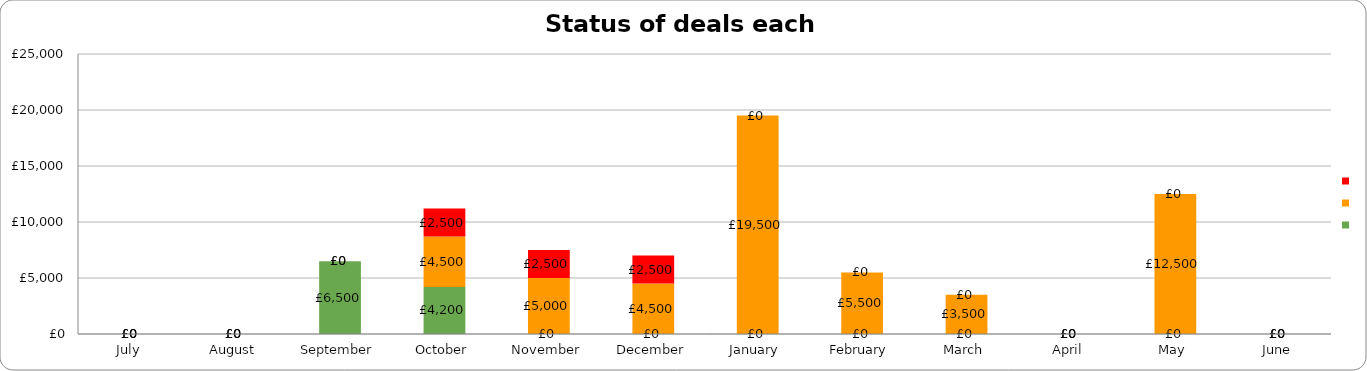
| Category | Series 0 | Series 1 | Series 2 |
|---|---|---|---|
| 2019-07-01 | 0 | 0 | 0 |
| 2019-08-01 | 0 | 0 | 0 |
| 2019-09-01 | 6500 | 0 | 0 |
| 2019-10-01 | 4200 | 4500 | 2500 |
| 2019-11-01 | 0 | 5000 | 2500 |
| 2019-12-01 | 0 | 4500 | 2500 |
| 2020-01-01 | 0 | 19500 | 0 |
| 2020-02-01 | 0 | 5500 | 0 |
| 2020-03-01 | 0 | 3500 | 0 |
| 2020-04-01 | 0 | 0 | 0 |
| 2020-05-01 | 0 | 12500 | 0 |
| 2020-06-01 | 0 | 0 | 0 |